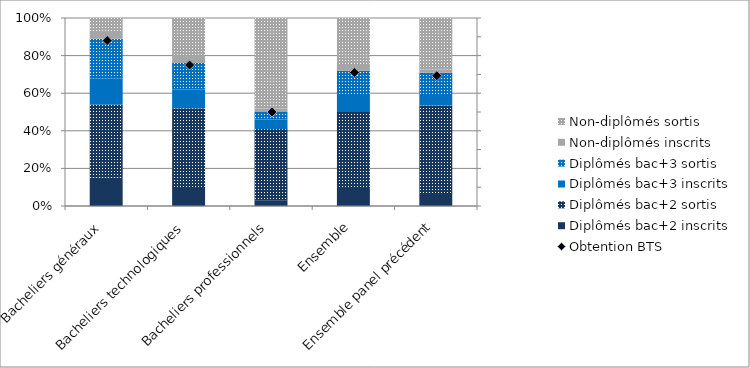
| Category | Diplômés bac+2 inscrits | Diplômés bac+2 sortis | Diplômés bac+3 inscrits | Diplômés bac+3 sortis | Non-diplômés inscrits | Non-diplômés sortis |
|---|---|---|---|---|---|---|
| Bacheliers généraux | 15 | 39 | 14 | 21 | 3 | 8 |
| Bacheliers technologiques | 9 | 43 | 10 | 14 | 4 | 20 |
| Bacheliers professionnels | 3 | 38 | 5 | 4 | 2 | 48 |
| Ensemble | 9 | 41 | 9 | 13 | 3 | 25 |
| Ensemble panel précédent | 5.909 | 47.546 | 6.178 | 11.192 | 1.916 | 27.259 |